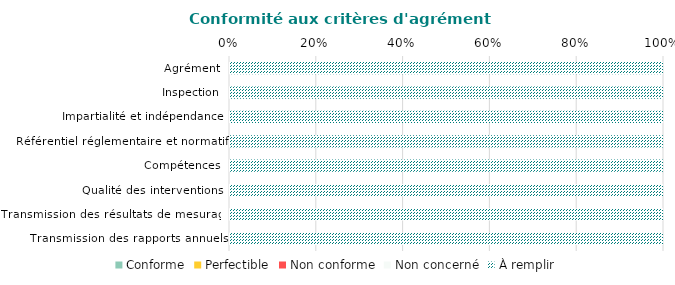
| Category | Conforme | Perfectible | Non conforme | Non concerné | À remplir |
|---|---|---|---|---|---|
| Agrément | 0 | 0 | 0 | 0 | 1 |
| Inspection | 0 | 0 | 0 | 0 | 1 |
| Impartialité et indépendance | 0 | 0 | 0 | 0 | 1 |
| Référentiel réglementaire et normatif | 0 | 0 | 0 | 0 | 1 |
| Compétences | 0 | 0 | 0 | 0 | 1 |
| Qualité des interventions | 0 | 0 | 0 | 0 | 1 |
| Transmission des résultats de mesurage | 0 | 0 | 0 | 0 | 1 |
| Transmission des rapports annuels | 0 | 0 | 0 | 0 | 1 |